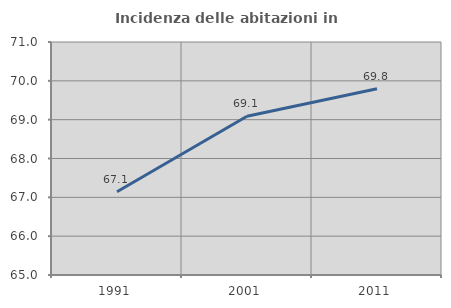
| Category | Incidenza delle abitazioni in proprietà  |
|---|---|
| 1991.0 | 67.143 |
| 2001.0 | 69.087 |
| 2011.0 | 69.797 |